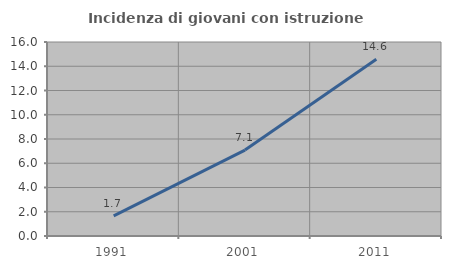
| Category | Incidenza di giovani con istruzione universitaria |
|---|---|
| 1991.0 | 1.667 |
| 2001.0 | 7.084 |
| 2011.0 | 14.583 |